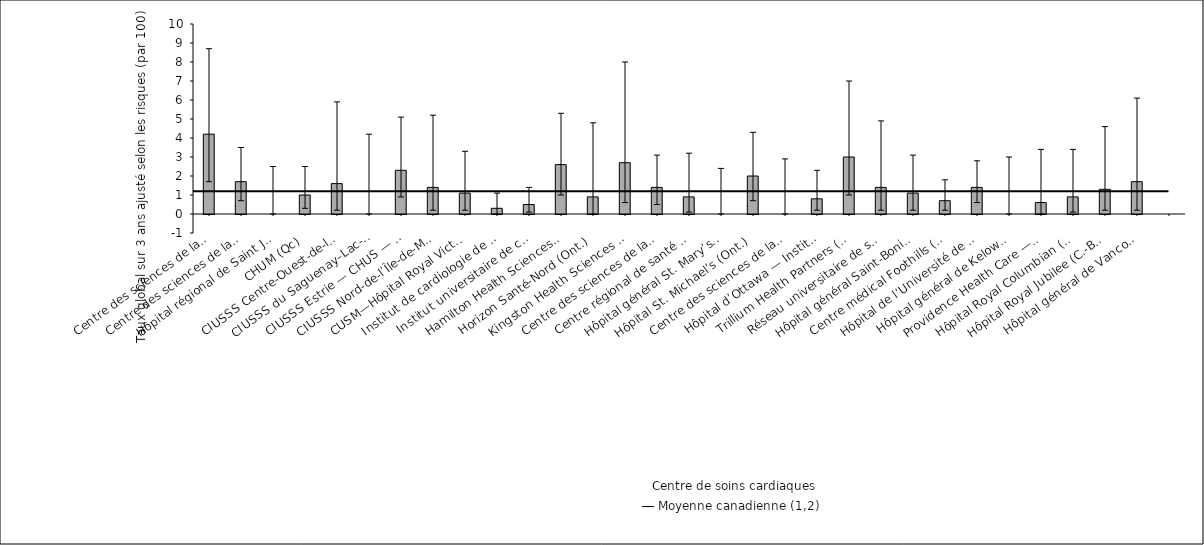
| Category | Taux ajusté selon les risques |
|---|---|
| Centre des sciences de la santé — St. John’s* (T. -N.-L.) | 4.2 |
| Centre des sciences de la santé Queen Elizabeth II (N.-É.) | 1.7 |
| Hôpital régional de Saint John (N.-B.) | 0 |
| CHUM (Qc) | 1 |
| CIUSSS Centre-Ouest-de-l’Île-de-Mtl — Hôpital général juif (Qc) | 1.6 |
| CIUSSS du Saguenay–Lac-St-Jean — Hôpital de Chicoutimi (Qc) | 0 |
| CIUSSS Estrie — CHUS — Hôpital Fleurimont (Qc) | 2.3 |
| CIUSSS Nord-de-l’Île-de-Montréal — Hôpital du Sacré-Cœur de Montréal (Qc) | 1.4 |
| CUSM—Hôpital Royal Victoria (Qc) | 1.1 |
| Institut de cardiologie de Montréal* (Qc) | 0.3 |
| Institut universitaire de cardiologie et pneumologie de Québec (Qc) | 0.5 |
| Hamilton Health Sciences (Ont.) | 2.6 |
| Horizon Santé-Nord (Ont.) | 0.9 |
| Kingston Health Sciences Centre (Ont.) | 2.7 |
| Centre des sciences de la santé de London (Ont.) | 1.4 |
| Centre régional de santé Southlake (Ont.) | 0.9 |
| Hôpital général St. Mary’s (Ont.) | 0 |
| Hôpital St. Michael’s (Ont.) | 2 |
| Centre des sciences de la santé Sunnybrook (Ont.) | 0 |
| Hôpital d’Ottawa — Institut de cardiologie de l’Université d’Ottawa (Ont.) | 0.8 |
| Trillium Health Partners (Ont.) | 3 |
| Réseau universitaire de santé (Ont.) | 1.4 |
| Hôpital général Saint-Boniface (Man.) | 1.1 |
| Centre médical Foothills (Alb.) | 0.7 |
| Hôpital de l’Université de l’Alberta (Alb.) | 1.4 |
| Hôpital général de Kelowna (C.-B.) | 0 |
| Providence Health Care — Hôpital St. Paul’s (Vancouver) (C.-B.) | 0.6 |
| Hôpital Royal Columbian (C.-B.) | 0.9 |
| Hôpital Royal Jubilee (C.-B.) | 1.3 |
| Hôpital général de Vancouver (C.-B.) | 1.7 |